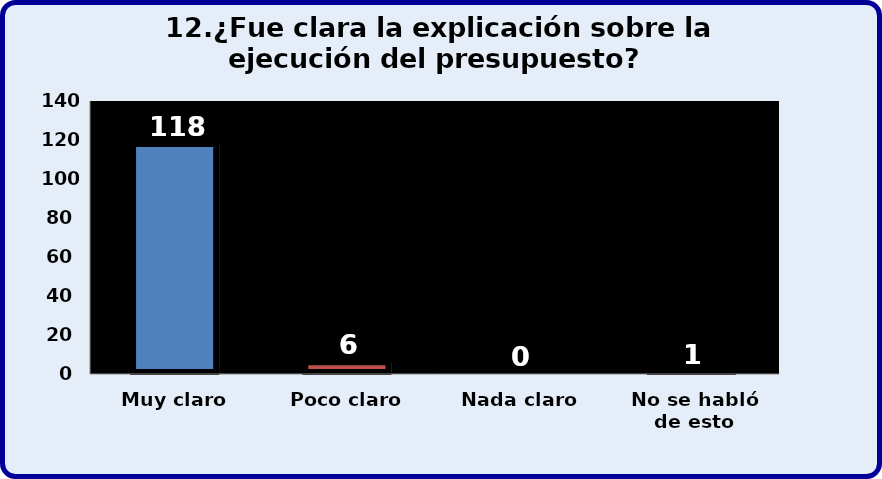
| Category | Series 0 |
|---|---|
| Muy claro | 118 |
| Poco claro | 6 |
| Nada claro | 0 |
| No se habló de esto | 1 |